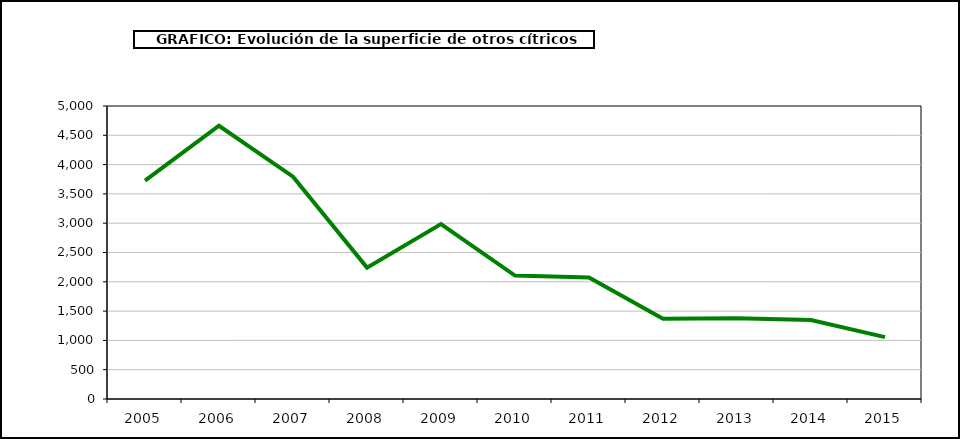
| Category | superficie |
|---|---|
| 2005.0 | 3726 |
| 2006.0 | 4663 |
| 2007.0 | 3794 |
| 2008.0 | 2242 |
| 2009.0 | 2984 |
| 2010.0 | 2106 |
| 2011.0 | 2074 |
| 2012.0 | 1368 |
| 2013.0 | 1377 |
| 2014.0 | 1349 |
| 2015.0 | 1056 |